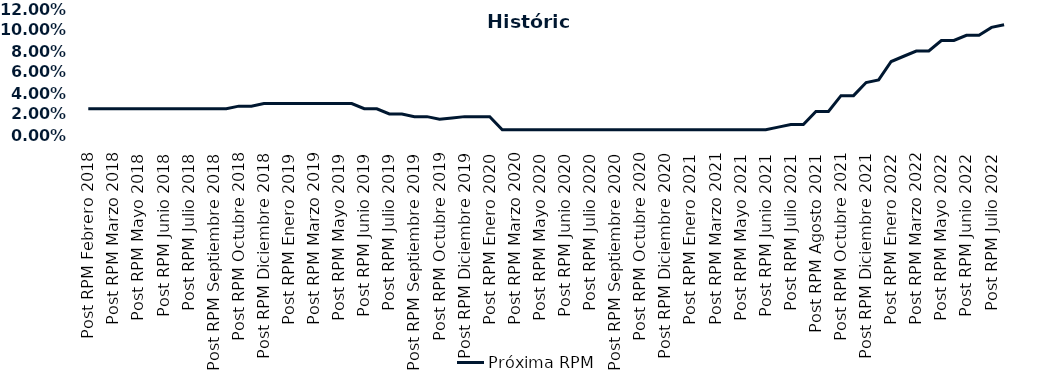
| Category | Próxima RPM |
|---|---|
| Post RPM Febrero 2018 | 0.025 |
| Pre RPM Marzo 2018 | 0.025 |
| Post RPM Marzo 2018 | 0.025 |
| Pre RPM Mayo 2018 | 0.025 |
| Post RPM Mayo 2018 | 0.025 |
| Pre RPM Junio 2018 | 0.025 |
| Post RPM Junio 2018 | 0.025 |
| Pre RPM Julio 2018 | 0.025 |
| Post RPM Julio 2018 | 0.025 |
| Pre RPM Septiembre 2018 | 0.025 |
| Post RPM Septiembre 2018 | 0.025 |
| Pre RPM Octubre 2018 | 0.025 |
| Post RPM Octubre 2018 | 0.028 |
| Pre RPM Diciembre 2018 | 0.028 |
| Post RPM Diciembre 2018 | 0.03 |
| Pre RPM Enero 2019 | 0.03 |
| Post RPM Enero 2019 | 0.03 |
| Pre RPM Marzo 2019 | 0.03 |
| Post RPM Marzo 2019 | 0.03 |
| Pre RPM Mayo 2019 | 0.03 |
| Post RPM Mayo 2019 | 0.03 |
| Pre RPM Junio 2019 | 0.03 |
| Post RPM Junio 2019 | 0.025 |
| Pre RPM Julio 2019 | 0.025 |
| Post RPM Julio 2019 | 0.02 |
| Pre RPM Septiembre 2019 | 0.02 |
| Post RPM Septiembre 2019 | 0.018 |
| Pre RPM Octubre 2019 | 0.018 |
| Post RPM Octubre 2019 | 0.015 |
| Pre RPM Diciembre 2019 | 0.016 |
| Post RPM Diciembre 2019 | 0.018 |
| Pre RPM Enero 2020 | 0.018 |
| Post RPM Enero 2020 | 0.018 |
| Pre RPM Marzo 2020 | 0.005 |
| Post RPM Marzo 2020 | 0.005 |
| Pre RPM Mayo 2020 | 0.005 |
| Post RPM Mayo 2020 | 0.005 |
| Pre RPM Junio 2020 | 0.005 |
| Post RPM Junio 2020 | 0.005 |
| Pre RPM Julio 2020 | 0.005 |
| Post RPM Julio 2020 | 0.005 |
| Pre RPM Septiembre 2020 | 0.005 |
| Post RPM Septiembre 2020 | 0.005 |
| Pre RPM Octubre 2020 | 0.005 |
| Post RPM Octubre 2020 | 0.005 |
| Pre RPM Diciembre 2020 | 0.005 |
| Post RPM Diciembre 2020 | 0.005 |
| Pre RPM Enero 2021 | 0.005 |
| Post RPM Enero 2021 | 0.005 |
| Pre RPM Marzo 2021 | 0.005 |
| Post RPM Marzo 2021 | 0.005 |
| Pre RPM Mayo 2021 | 0.005 |
| Post RPM Mayo 2021 | 0.005 |
| Pre RPM Junio 2021 | 0.005 |
| Post RPM Junio 2021 | 0.005 |
| Pre RPM Julio 2021 | 0.008 |
| Post RPM Julio 2021 | 0.01 |
| Pre RPM Agosto 2021 | 0.01 |
| Post RPM Agosto 2021 | 0.022 |
| Pre RPM Octubre 2021 | 0.022 |
| Post RPM Octubre 2021 | 0.038 |
| Pre RPM Diciembre 2021 | 0.038 |
| Post RPM Diciembre 2021 | 0.05 |
| Pre RPM Enero 2022 | 0.052 |
| Post RPM Enero 2022 | 0.07 |
| Pre RPM Marzo 2022 | 0.075 |
| Post RPM Marzo 2022 | 0.08 |
| Pre RPM Mayo 2022 | 0.08 |
| Post RPM Mayo 2022 | 0.09 |
| Pre RPM Junio 2022 | 0.09 |
| Post RPM Junio 2022 | 0.095 |
| Pre RPM Julio 2022 | 0.095 |
| Post RPM Julio 2022 | 0.102 |
| Pre RPM Septiembre 2022 | 0.105 |